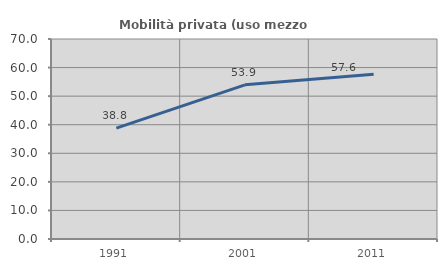
| Category | Mobilità privata (uso mezzo privato) |
|---|---|
| 1991.0 | 38.786 |
| 2001.0 | 53.949 |
| 2011.0 | 57.631 |